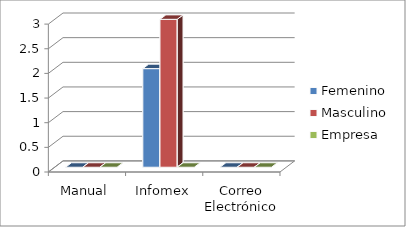
| Category | Femenino | Masculino | Empresa |
|---|---|---|---|
| 0 | 0 | 0 | 0 |
| 1 | 2 | 3 | 0 |
| 2 | 0 | 0 | 0 |